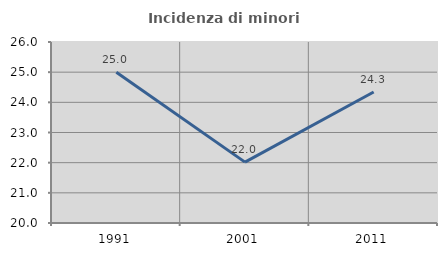
| Category | Incidenza di minori stranieri |
|---|---|
| 1991.0 | 25 |
| 2001.0 | 22.018 |
| 2011.0 | 24.342 |